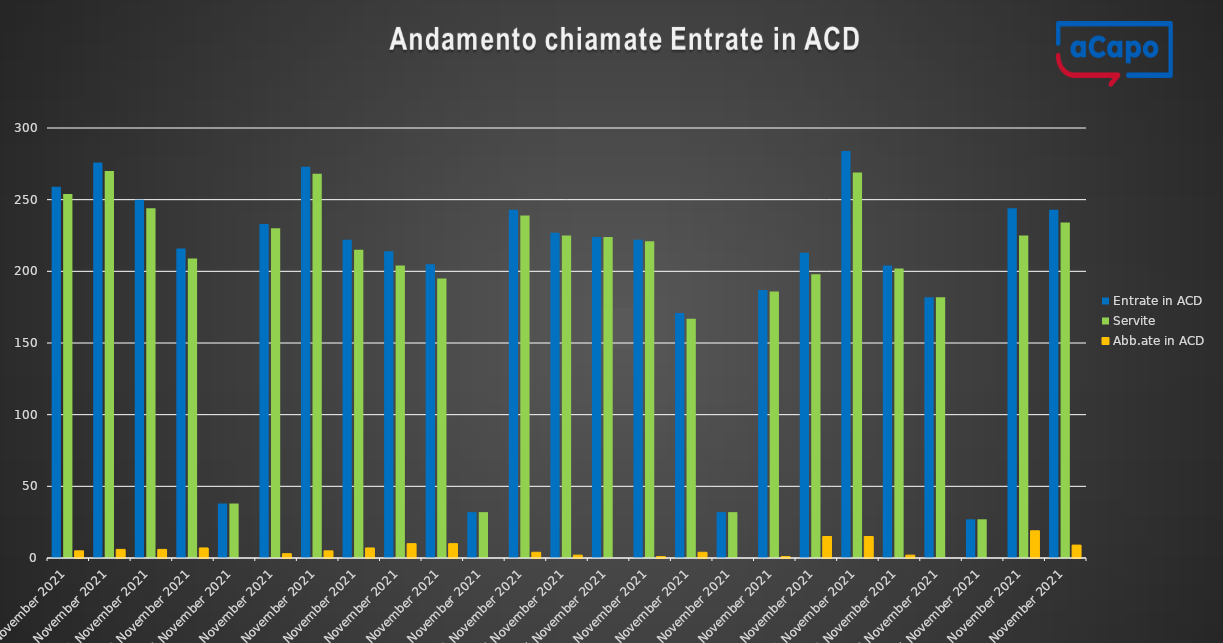
| Category | Entrate in ACD | Servite | Abb.ate in ACD |
|---|---|---|---|
| 2021-11-02 | 259 | 254 | 5 |
| 2021-11-03 | 276 | 270 | 6 |
| 2021-11-04 | 250 | 244 | 6 |
| 2021-11-05 | 216 | 209 | 7 |
| 2021-11-06 | 38 | 38 | 0 |
| 2021-11-08 | 233 | 230 | 3 |
| 2021-11-09 | 273 | 268 | 5 |
| 2021-11-10 | 222 | 215 | 7 |
| 2021-11-11 | 214 | 204 | 10 |
| 2021-11-12 | 205 | 195 | 10 |
| 2021-11-13 | 32 | 32 | 0 |
| 2021-11-15 | 243 | 239 | 4 |
| 2021-11-16 | 227 | 225 | 2 |
| 2021-11-17 | 224 | 224 | 0 |
| 2021-11-18 | 222 | 221 | 1 |
| 2021-11-19 | 171 | 167 | 4 |
| 2021-11-20 | 32 | 32 | 0 |
| 2021-11-22 | 187 | 186 | 1 |
| 2021-11-23 | 213 | 198 | 15 |
| 2021-11-24 | 284 | 269 | 15 |
| 2021-11-25 | 204 | 202 | 2 |
| 2021-11-26 | 182 | 182 | 0 |
| 2021-11-27 | 27 | 27 | 0 |
| 2021-11-29 | 244 | 225 | 19 |
| 2021-11-30 | 243 | 234 | 9 |